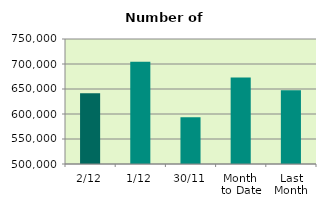
| Category | Series 0 |
|---|---|
| 2/12 | 641722 |
| 1/12 | 704664 |
| 30/11 | 593580 |
| Month 
to Date | 673193 |
| Last
Month | 647745.364 |